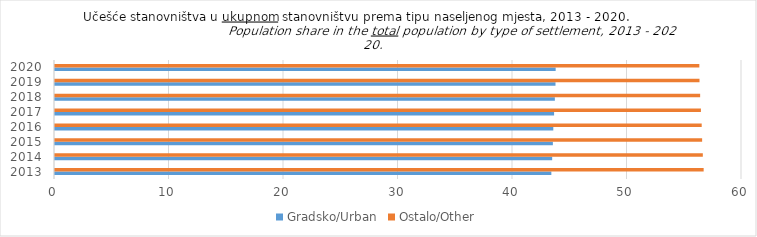
| Category | Gradsko/Urban | Ostalo/Other |
|---|---|---|
| 0 | 43.349 | 56.651 |
| 1 | 43.422 | 56.578 |
| 2 | 43.483 | 56.517 |
| 3 | 43.52 | 56.48 |
| 4 | 43.588 | 56.412 |
| 5 | 43.656 | 56.344 |
| 6 | 43.712 | 56.288 |
| 7 | 43.726 | 56.274 |